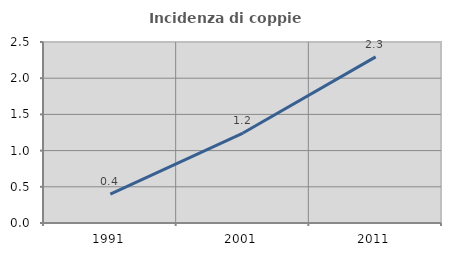
| Category | Incidenza di coppie miste |
|---|---|
| 1991.0 | 0.397 |
| 2001.0 | 1.242 |
| 2011.0 | 2.295 |